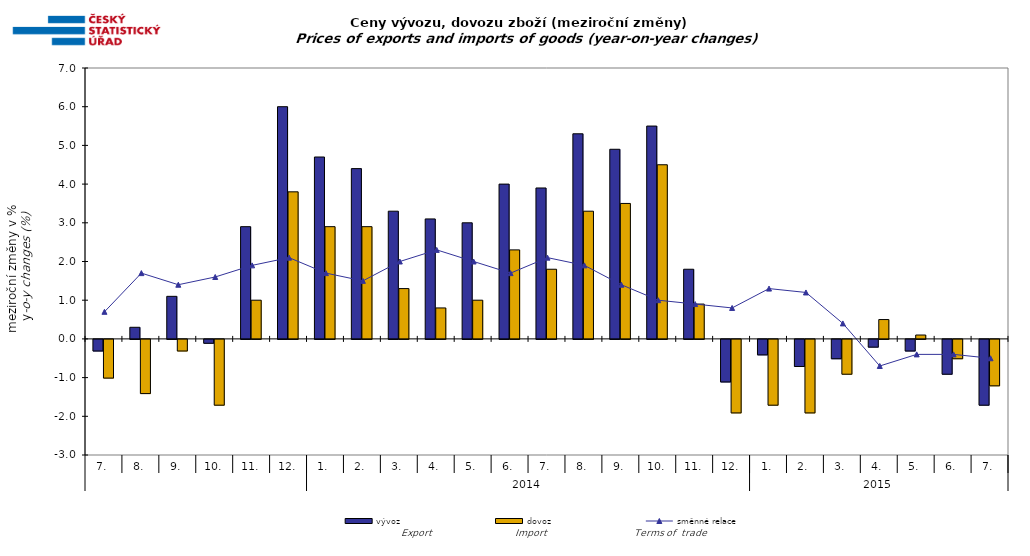
| Category | vývoz | dovoz |
|---|---|---|
| 0 | -0.3 | -1 |
| 1 | 0.3 | -1.4 |
| 2 | 1.1 | -0.3 |
| 3 | -0.1 | -1.7 |
| 4 | 2.9 | 1 |
| 5 | 6 | 3.8 |
| 6 | 4.7 | 2.9 |
| 7 | 4.4 | 2.9 |
| 8 | 3.3 | 1.3 |
| 9 | 3.1 | 0.8 |
| 10 | 3 | 1 |
| 11 | 4 | 2.3 |
| 12 | 3.9 | 1.8 |
| 13 | 5.3 | 3.3 |
| 14 | 4.9 | 3.5 |
| 15 | 5.5 | 4.5 |
| 16 | 1.8 | 0.9 |
| 17 | -1.1 | -1.9 |
| 18 | -0.4 | -1.7 |
| 19 | -0.7 | -1.9 |
| 20 | -0.5 | -0.9 |
| 21 | -0.2 | 0.5 |
| 22 | -0.3 | 0.1 |
| 23 | -0.9 | -0.5 |
| 24 | -1.7 | -1.2 |